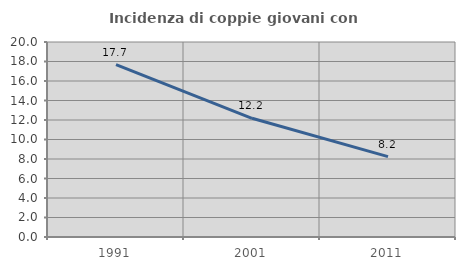
| Category | Incidenza di coppie giovani con figli |
|---|---|
| 1991.0 | 17.683 |
| 2001.0 | 12.175 |
| 2011.0 | 8.244 |